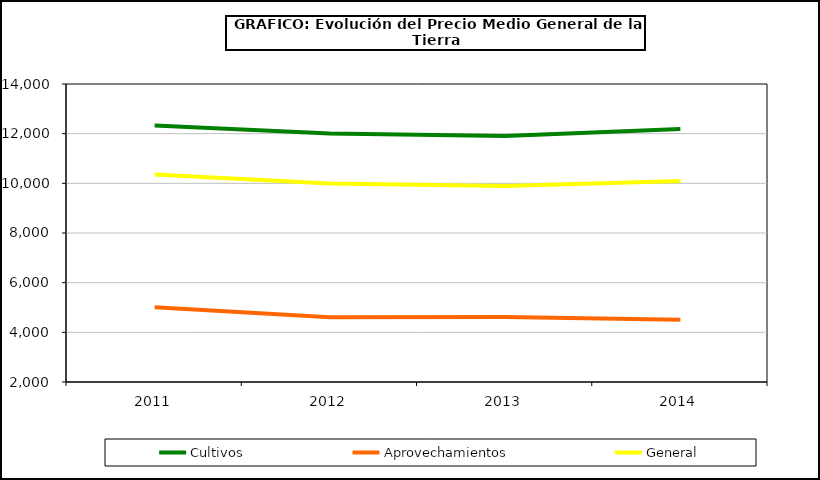
| Category | Cultivos | Aprovechamientos | General |
|---|---|---|---|
| 2011.0 | 12325 |  |  |
| 2012.0 | 12005.431 |  |  |
| 2013.0 | 11910.019 |  |  |
| 2014.0 | 12192.232 |  |  |